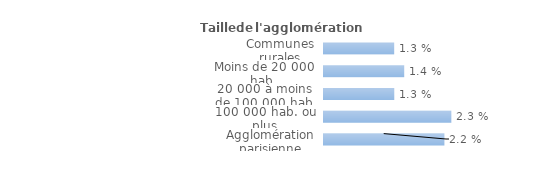
| Category | Series 0 |
|---|---|
| Communes rurales | 0.013 |
| Moins de 20 000 hab. | 0.014 |
| 20 000 à moins de 100 000 hab. | 0.013 |
| 100 000 hab. ou plus | 0.023 |
| Agglomération parisienne | 0.022 |